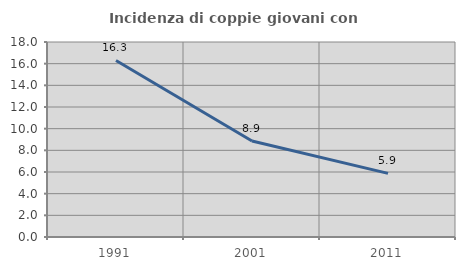
| Category | Incidenza di coppie giovani con figli |
|---|---|
| 1991.0 | 16.3 |
| 2001.0 | 8.862 |
| 2011.0 | 5.87 |